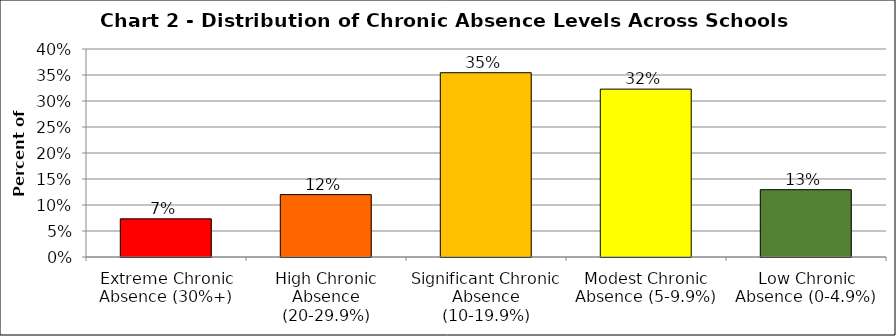
| Category | Series 1 |
|---|---|
| Extreme Chronic Absence (30%+) | 0.073 |
| High Chronic Absence (20-29.9%) | 0.12 |
| Significant Chronic Absence (10-19.9%) | 0.354 |
| Modest Chronic Absence (5-9.9%) | 0.323 |
| Low Chronic Absence (0-4.9%) | 0.129 |